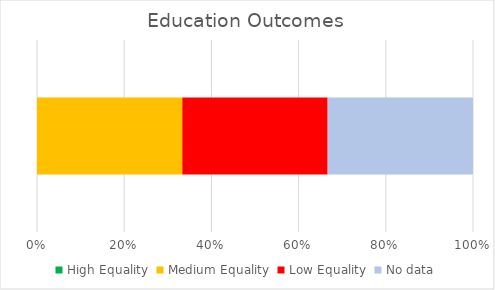
| Category | High Equality | Medium Equality | Low Equality | No data |
|---|---|---|---|---|
| 0 | 0 | 1 | 1 | 1 |